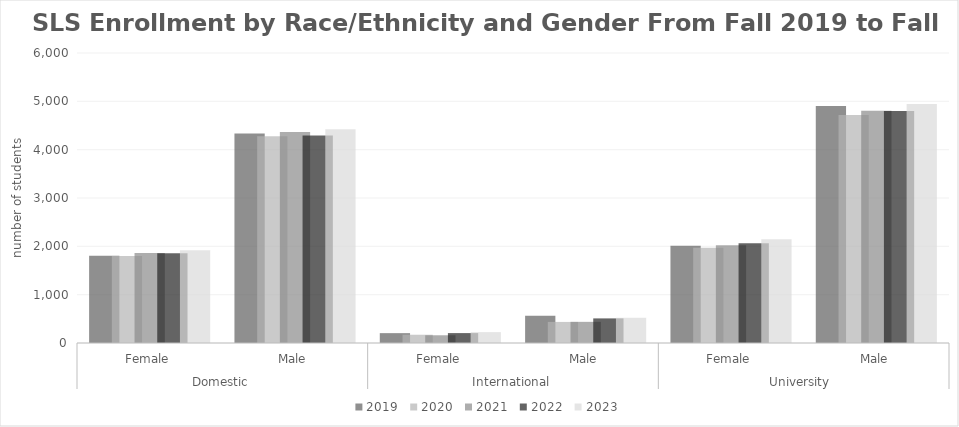
| Category | 2019  | 2020  | 2021  | 2022  | 2023  |
|---|---|---|---|---|---|
| 0 | 1807 | 1800 | 1861 | 1857 | 1920 |
| 1 | 4337 | 4280 | 4365 | 4292 | 4423 |
| 2 | 204 | 171 | 160 | 205 | 225 |
| 3 | 564 | 436 | 438 | 509 | 522 |
| 4 | 2011 | 1971 | 2021 | 2062 | 2145 |
| 5 | 4901 | 4716 | 4803 | 4801 | 4945 |